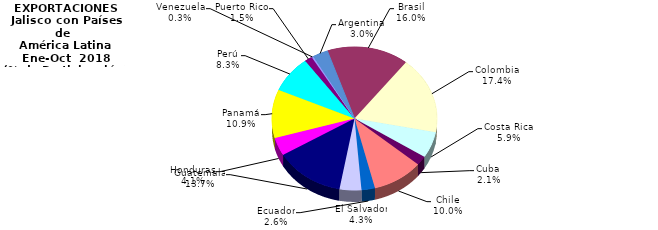
| Category | EXPORTACIONES |
|---|---|
| Argentina  | 70.562 |
| Brasil | 376.589 |
| Colombia | 409.403 |
| Costa Rica | 139.203 |
| Cuba | 49.207 |
| Chile | 234.31 |
| Ecuador | 61.642 |
| El Salvador | 100.16 |
| Guatemala | 321.382 |
| Honduras | 95.516 |
| Panamá | 256.196 |
| Perú | 195.759 |
| Puerto Rico | 34.962 |
| Venezuela | 8.114 |